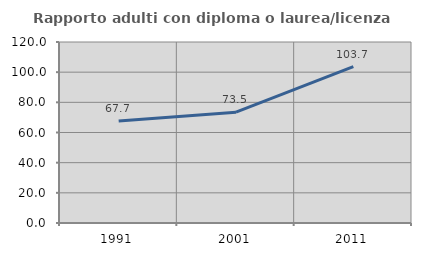
| Category | Rapporto adulti con diploma o laurea/licenza media  |
|---|---|
| 1991.0 | 67.692 |
| 2001.0 | 73.49 |
| 2011.0 | 103.654 |